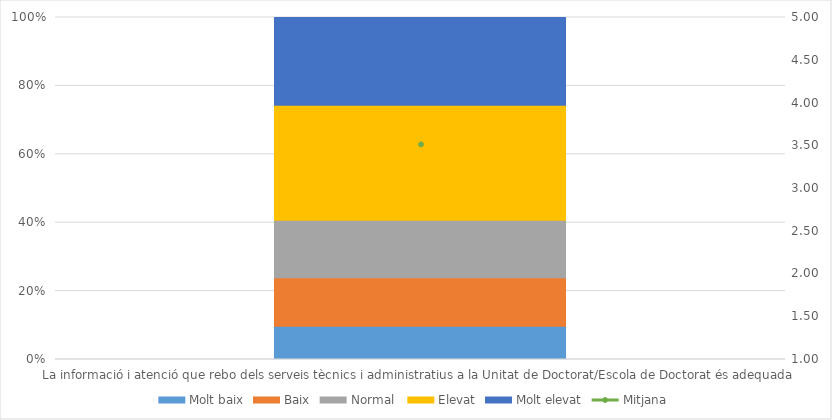
| Category | Molt baix | Baix | Normal  | Elevat | Molt elevat |
|---|---|---|---|---|---|
| La informació i atenció que rebo dels serveis tècnics i administratius a la Unitat de Doctorat/Escola de Doctorat és adequada | 11 | 16 | 19 | 38 | 29 |